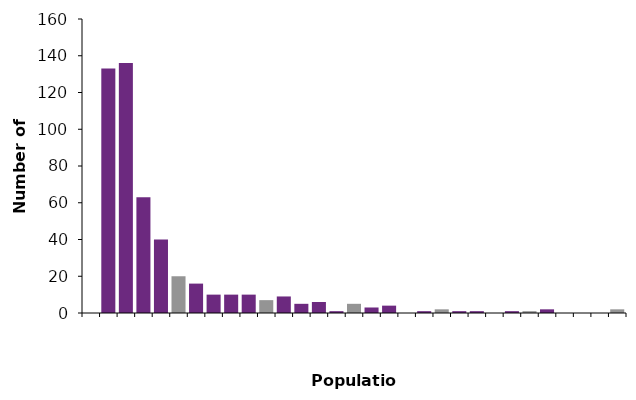
| Category | Frequency
[Note 1] |
|---|---|
|  | 0 |
| 0 - 1,000 | 133 |
| 1,001 - 2,000 | 136 |
| 2,001 - 3,000 | 63 |
| 3,001 - 4,000 | 40 |
| 4,001 - 5,000 | 20 |
| 5,001 - 6,000 | 16 |
| 6,001 - 7,000 | 10 |
| 7,001 - 8,000 | 10 |
| 8,001 - 9,000 | 10 |
| 9,001- 10,000 | 7 |
| 10,001 - 11,000 | 9 |
| 11,001 - 12,000 | 5 |
| 12,001 - 13,000 | 6 |
| 13,001 - 14,000 | 1 |
| 14,001 - 15,000 | 5 |
| 15,001 - 16,000 | 3 |
| 16,001 - 17,000 | 4 |
| 17,001 - 18,000 | 0 |
| 18,001 - 19,000 | 1 |
| 19,001 - 20,000 | 2 |
| 20,001 - 21,000 | 1 |
| 21,001 - 22,000 | 1 |
| 22,001 - 23,000 | 0 |
| 23,001 - 24,000 | 1 |
| 24,001 - 25,000 | 1 |
| 25,001 - 26,000 | 2 |
| 26,001 - 27,000 | 0 |
| 27,001 - 28,000 | 0 |
| 28,001 - 29,000 | 0 |
| 29,001 - 30,000 | 2 |